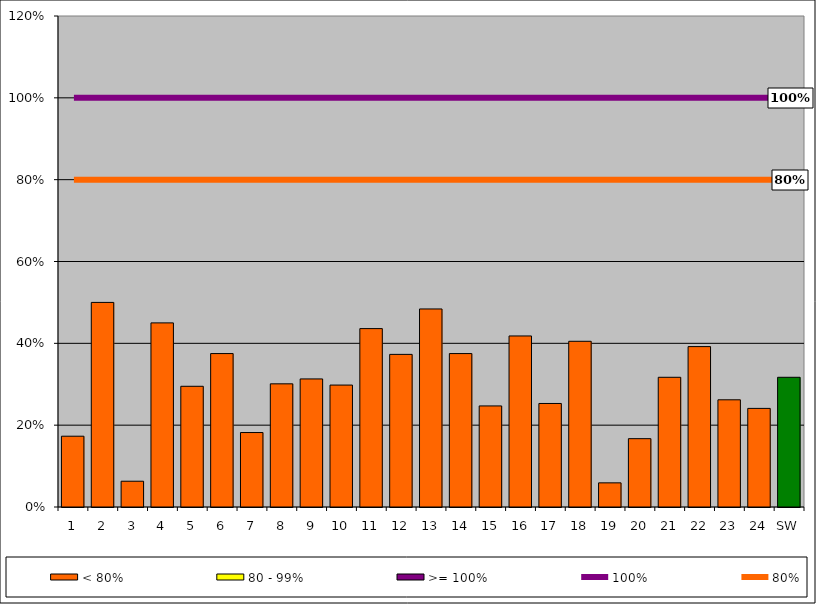
| Category | < 80% | 80 - 99% | >= 100% |
|---|---|---|---|
| 1 | 0.173 | 0 | 0 |
| 2 | 0.5 | 0 | 0 |
| 3 | 0.063 | 0 | 0 |
| 4 | 0.45 | 0 | 0 |
| 5 | 0.295 | 0 | 0 |
| 6 | 0.375 | 0 | 0 |
| 7 | 0.182 | 0 | 0 |
| 8 | 0.301 | 0 | 0 |
| 9 | 0.313 | 0 | 0 |
| 10 | 0.298 | 0 | 0 |
| 11 | 0.436 | 0 | 0 |
| 12 | 0.373 | 0 | 0 |
| 13 | 0.484 | 0 | 0 |
| 14 | 0.375 | 0 | 0 |
| 15 | 0.247 | 0 | 0 |
| 16 | 0.418 | 0 | 0 |
| 17 | 0.253 | 0 | 0 |
| 18 | 0.405 | 0 | 0 |
| 19 | 0.059 | 0 | 0 |
| 20 | 0.167 | 0 | 0 |
| 21 | 0.317 | 0 | 0 |
| 22 | 0.392 | 0 | 0 |
| 23 | 0.262 | 0 | 0 |
| 24 | 0.241 | 0 | 0 |
| SW | 0.317 | 0 | 0 |